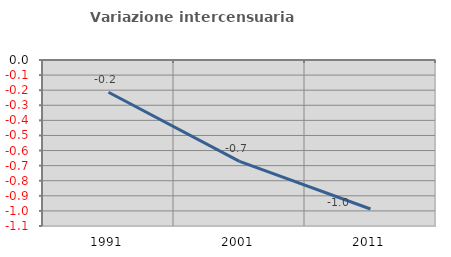
| Category | Variazione intercensuaria annua |
|---|---|
| 1991.0 | -0.214 |
| 2001.0 | -0.671 |
| 2011.0 | -0.988 |